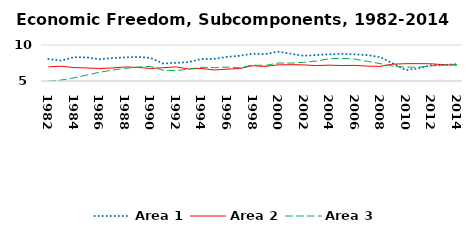
| Category | Area 1 | Area 2 | Area 3 |
|---|---|---|---|
| 1982.0 | 8.053 | 6.97 | 4.973 |
| 1983.0 | 7.825 | 7.048 | 5.131 |
| 1984.0 | 8.313 | 6.873 | 5.44 |
| 1985.0 | 8.29 | 6.804 | 5.819 |
| 1986.0 | 8.014 | 6.738 | 6.218 |
| 1987.0 | 8.179 | 6.8 | 6.503 |
| 1988.0 | 8.281 | 6.949 | 6.76 |
| 1989.0 | 8.342 | 6.886 | 6.935 |
| 1990.0 | 8.215 | 6.741 | 7.023 |
| 1991.0 | 7.433 | 6.849 | 6.482 |
| 1992.0 | 7.523 | 6.968 | 6.448 |
| 1993.0 | 7.622 | 6.673 | 6.657 |
| 1994.0 | 8.047 | 6.747 | 6.913 |
| 1995.0 | 8.073 | 6.532 | 6.857 |
| 1996.0 | 8.351 | 6.64 | 6.923 |
| 1997.0 | 8.497 | 6.732 | 6.834 |
| 1998.0 | 8.803 | 7.117 | 7.214 |
| 1999.0 | 8.724 | 7.033 | 7.154 |
| 2000.0 | 9.075 | 7.241 | 7.498 |
| 2001.0 | 8.788 | 7.268 | 7.488 |
| 2002.0 | 8.502 | 7.238 | 7.586 |
| 2003.0 | 8.604 | 7.141 | 7.773 |
| 2004.0 | 8.706 | 7.201 | 8.08 |
| 2005.0 | 8.778 | 7.149 | 8.166 |
| 2006.0 | 8.703 | 7.17 | 8.047 |
| 2007.0 | 8.597 | 7.066 | 7.718 |
| 2008.0 | 8.319 | 7.033 | 7.416 |
| 2009.0 | 7.445 | 7.338 | 7.046 |
| 2010.0 | 6.515 | 7.403 | 6.936 |
| 2011.0 | 6.756 | 7.412 | 6.912 |
| 2012.0 | 7.191 | 7.39 | 7.103 |
| 2013.0 | 7.236 | 7.266 | 7.21 |
| 2014.0 | 7.33 | 7.207 | 7.283 |